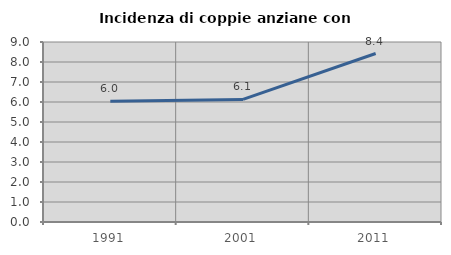
| Category | Incidenza di coppie anziane con figli |
|---|---|
| 1991.0 | 6.042 |
| 2001.0 | 6.128 |
| 2011.0 | 8.424 |